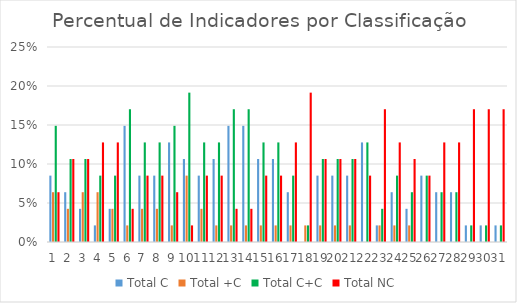
| Category | Total C | Total +C | Total C+C | Total NC |
|---|---|---|---|---|
| 0 | 0.085 | 0.064 | 0.149 | 0.064 |
| 1 | 0.064 | 0.043 | 0.106 | 0.106 |
| 2 | 0.043 | 0.064 | 0.106 | 0.106 |
| 3 | 0.021 | 0.064 | 0.085 | 0.128 |
| 4 | 0.043 | 0.043 | 0.085 | 0.128 |
| 5 | 0.149 | 0.021 | 0.17 | 0.043 |
| 6 | 0.085 | 0.043 | 0.128 | 0.085 |
| 7 | 0.085 | 0.043 | 0.128 | 0.085 |
| 8 | 0.128 | 0.021 | 0.149 | 0.064 |
| 9 | 0.106 | 0.085 | 0.191 | 0.021 |
| 10 | 0.085 | 0.043 | 0.128 | 0.085 |
| 11 | 0.106 | 0.021 | 0.128 | 0.085 |
| 12 | 0.149 | 0.021 | 0.17 | 0.043 |
| 13 | 0.149 | 0.021 | 0.17 | 0.043 |
| 14 | 0.106 | 0.021 | 0.128 | 0.085 |
| 15 | 0.106 | 0.021 | 0.128 | 0.085 |
| 16 | 0.064 | 0.021 | 0.085 | 0.128 |
| 17 | 0 | 0.021 | 0.021 | 0.191 |
| 18 | 0.085 | 0.021 | 0.106 | 0.106 |
| 19 | 0.085 | 0.021 | 0.106 | 0.106 |
| 20 | 0.085 | 0.021 | 0.106 | 0.106 |
| 21 | 0.128 | 0 | 0.128 | 0.085 |
| 22 | 0.021 | 0.021 | 0.043 | 0.17 |
| 23 | 0.064 | 0.021 | 0.085 | 0.128 |
| 24 | 0.043 | 0.021 | 0.064 | 0.106 |
| 25 | 0.085 | 0 | 0.085 | 0.085 |
| 26 | 0.064 | 0 | 0.064 | 0.128 |
| 27 | 0.064 | 0 | 0.064 | 0.128 |
| 28 | 0.021 | 0 | 0.021 | 0.17 |
| 29 | 0.021 | 0 | 0.021 | 0.17 |
| 30 | 0.021 | 0 | 0.021 | 0.17 |